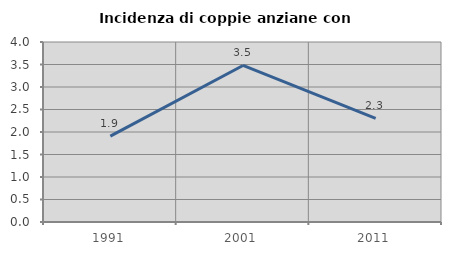
| Category | Incidenza di coppie anziane con figli |
|---|---|
| 1991.0 | 1.91 |
| 2001.0 | 3.478 |
| 2011.0 | 2.301 |